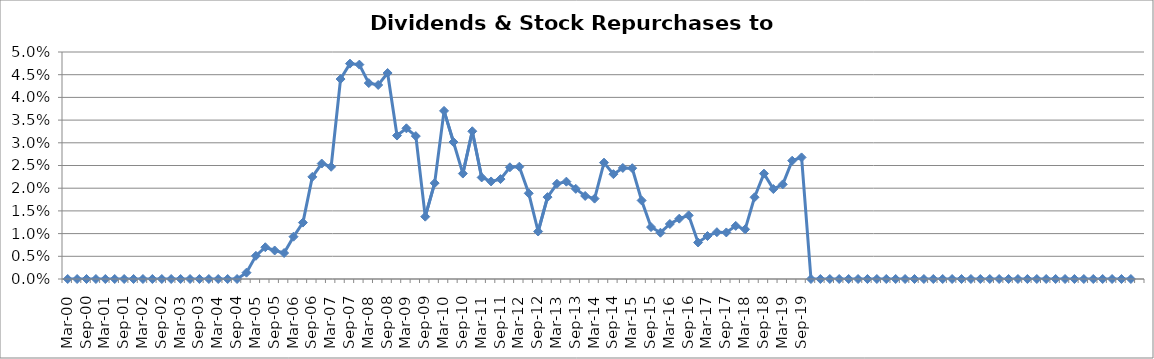
| Category | Dividends & Stock Repurchases to Revenue% |
|---|---|
| Mar-00 | 0 |
| Jun-00 | 0 |
| Sep-00 | 0 |
| Dec-00 | 0 |
| Mar-01 | 0 |
| Jun-01 | 0 |
| Sep-01 | 0 |
| Dec-01 | 0 |
| Mar-02 | 0 |
| Jun-02 | 0 |
| Sep-02 | 0 |
| Dec-02 | 0 |
| Mar-03 | 0 |
| Jun-03 | 0 |
| Sep-03 | 0 |
| Dec-03 | 0 |
| Mar-04 | 0 |
| Jun-04 | 0 |
| Sep-04 | 0 |
| Dec-04 | 0.001 |
| Mar-05 | 0.005 |
| Jun-05 | 0.007 |
| Sep-05 | 0.006 |
| Dec-05 | 0.006 |
| Mar-06 | 0.009 |
| Jun-06 | 0.012 |
| Sep-06 | 0.022 |
| Dec-06 | 0.025 |
| Mar-07 | 0.025 |
| Jun-07 | 0.044 |
| Sep-07 | 0.047 |
| Dec-07 | 0.047 |
| Mar-08 | 0.043 |
| Jun-08 | 0.043 |
| Sep-08 | 0.045 |
| Dec-08 | 0.032 |
| Mar-09 | 0.033 |
| Jun-09 | 0.031 |
| Sep-09 | 0.014 |
| Dec-09 | 0.021 |
| Mar-10 | 0.037 |
| Jun-10 | 0.03 |
| Sep-10 | 0.023 |
| Dec-10 | 0.033 |
| Mar-11 | 0.022 |
| Jun-11 | 0.021 |
| Sep-11 | 0.022 |
| Dec-11 | 0.025 |
| Mar-12 | 0.025 |
| Jun-12 | 0.019 |
| Sep-12 | 0.01 |
| Dec-12 | 0.018 |
| Mar-13 | 0.021 |
| Jun-13 | 0.021 |
| Sep-13 | 0.02 |
| Dec-13 | 0.018 |
| Mar-14 | 0.018 |
| Jun-14 | 0.026 |
| Sep-14 | 0.023 |
| Dec-14 | 0.024 |
| Mar-15 | 0.024 |
| Jun-15 | 0.017 |
| Sep-15 | 0.011 |
| Dec-15 | 0.01 |
| Mar-16 | 0.012 |
| Jun-16 | 0.013 |
| Sep-16 | 0.014 |
| Dec-16 | 0.008 |
| Mar-17 | 0.009 |
| Jun-17 | 0.01 |
| Sep-17 | 0.01 |
| Dec-17 | 0.012 |
| Mar-18 | 0.011 |
| Jun-18 | 0.018 |
| Sep-18 | 0.023 |
| Dec-18 | 0.02 |
| Mar-19 | 0.021 |
| Jun-19 | 0.026 |
| Sep-19 | 0.027 |